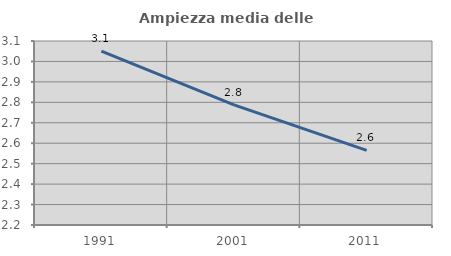
| Category | Ampiezza media delle famiglie |
|---|---|
| 1991.0 | 3.05 |
| 2001.0 | 2.788 |
| 2011.0 | 2.565 |